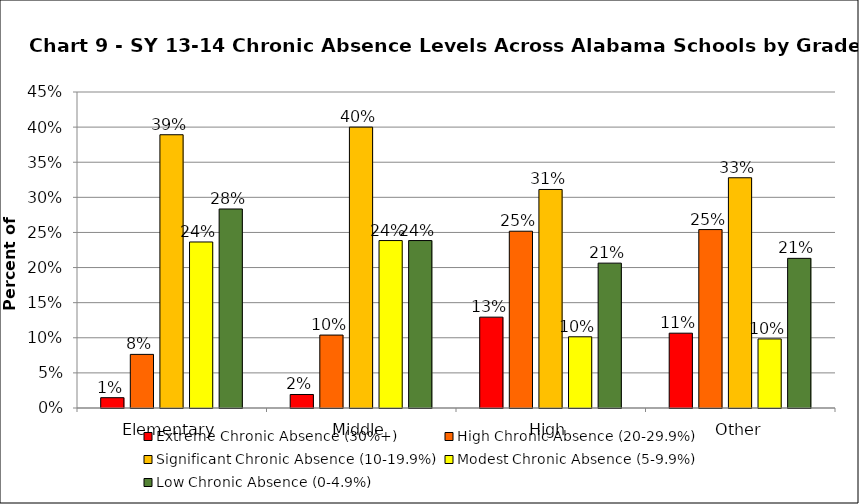
| Category | Extreme Chronic Absence (30%+) | High Chronic Absence (20-29.9%) | Significant Chronic Absence (10-19.9%) | Modest Chronic Absence (5-9.9%) | Low Chronic Absence (0-4.9%) |
|---|---|---|---|---|---|
| 0 | 0.015 | 0.076 | 0.389 | 0.236 | 0.283 |
| 1 | 0.019 | 0.104 | 0.4 | 0.238 | 0.238 |
| 2 | 0.129 | 0.252 | 0.311 | 0.101 | 0.206 |
| 3 | 0.107 | 0.254 | 0.328 | 0.098 | 0.213 |